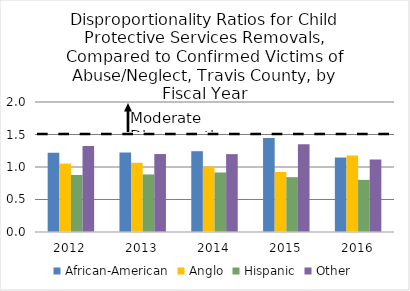
| Category | African-American | Anglo | Hispanic | Series 3 | Other |
|---|---|---|---|---|---|
| 2012.0 | 1.217 | 1.052 | 0.878 |  | 1.325 |
| 2013.0 | 1.222 | 1.065 | 0.885 |  | 1.199 |
| 2014.0 | 1.243 | 1.009 | 0.915 |  | 1.198 |
| 2015.0 | 1.445 | 0.924 | 0.844 |  | 1.351 |
| 2016.0 | 1.144 | 1.177 | 0.802 |  | 1.115 |